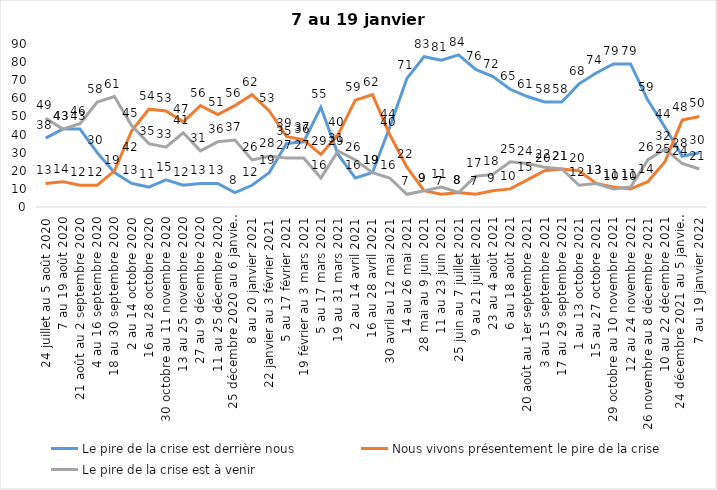
| Category | Le pire de la crise est derrière nous | Nous vivons présentement le pire de la crise | Le pire de la crise est à venir |
|---|---|---|---|
| 24 juillet au 5 août 2020 | 38 | 13 | 49 |
| 7 au 19 août 2020 | 43 | 14 | 43 |
| 21 août au 2 septembre 2020 | 43 | 12 | 46 |
| 4 au 16 septembre 2020 | 30 | 12 | 58 |
| 18 au 30 septembre 2020 | 19 | 20 | 61 |
| 2 au 14 octobre 2020 | 13 | 42 | 45 |
| 16 au 28 octobre 2020 | 11 | 54 | 35 |
| 30 octobre au 11 novembre 2020 | 15 | 53 | 33 |
| 13 au 25 novembre 2020 | 12 | 47 | 41 |
| 27 au 9 décembre 2020 | 13 | 56 | 31 |
| 11 au 25 décembre 2020 | 13 | 51 | 36 |
| 25 décembre 2020 au 6 janvier 2021 | 8 | 56 | 37 |
| 8 au 20 janvier 2021 | 12 | 62 | 26 |
| 22 janvier au 3 février 2021 | 19 | 53 | 28 |
| 5 au 17 février 2021 | 35 | 39 | 27 |
| 19 février au 3 mars 2021 | 36 | 37 | 27 |
| 5 au 17 mars 2021 | 55 | 29 | 16 |
| 19 au 31 mars 2021 | 29 | 40 | 31 |
| 2 au 14 avril 2021 | 16 | 59 | 26 |
| 16 au 28 avril 2021 | 19 | 62 | 19 |
| 30 avril au 12 mai 2021 | 44 | 40 | 16 |
| 14 au 26 mai 2021 | 71 | 22 | 7 |
| 28 mai au 9 juin 2021 | 83 | 9 | 9 |
| 11 au 23 juin 2021 | 81 | 7 | 11 |
| 25 juin au 7 juillet 2021 | 84 | 8 | 8 |
| 9 au 21 juillet 2021 | 76 | 7 | 17 |
| 23 au 4 août 2021 | 72 | 9 | 18 |
| 6 au 18 août 2021 | 65 | 10 | 25 |
| 20 août au 1er septembre 2021 | 61 | 15 | 24 |
| 3 au 15 septembre 2021 | 58 | 20 | 22 |
| 17 au 29 septembre 2021 | 58 | 21 | 21 |
| 1 au 13 octobre 2021 | 68 | 20 | 12 |
| 15 au 27 octobre 2021 | 74 | 13 | 13 |
| 29 octobre au 10 novembre 2021 | 79 | 11 | 10 |
| 12 au 24 novembre 2021 | 79 | 10 | 11 |
| 26 novembre au 8 décembre 2021 | 59 | 14 | 26 |
| 10 au 22 décembre 2021 | 44 | 25 | 32 |
| 24 décembre 2021 au 5 janvier 2022 | 28 | 48 | 24 |
| 7 au 19 janvier 2022 | 30 | 50 | 21 |